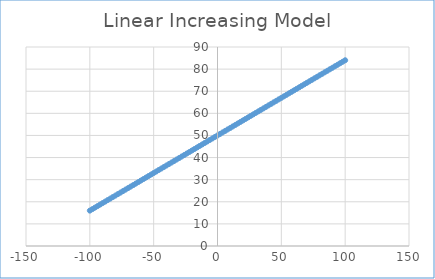
| Category | Y-Value |
|---|---|
| -100.0 | 16 |
| -98.0 | 16.68 |
| -96.0 | 17.36 |
| -94.0 | 18.04 |
| -92.0 | 18.72 |
| -90.0 | 19.4 |
| -88.0 | 20.08 |
| -86.0 | 20.76 |
| -84.0 | 21.44 |
| -82.0 | 22.12 |
| -80.0 | 22.8 |
| -78.0 | 23.48 |
| -76.0 | 24.16 |
| -74.0 | 24.84 |
| -72.0 | 25.52 |
| -70.0 | 26.2 |
| -68.0 | 26.88 |
| -66.0 | 27.56 |
| -64.0 | 28.24 |
| -62.0 | 28.92 |
| -60.0 | 29.6 |
| -58.0 | 30.28 |
| -56.0 | 30.96 |
| -54.0 | 31.64 |
| -52.0 | 32.32 |
| -50.0 | 33 |
| -48.0 | 33.68 |
| -46.0 | 34.36 |
| -44.0 | 35.04 |
| -42.0 | 35.72 |
| -40.0 | 36.4 |
| -38.0 | 37.08 |
| -36.0 | 37.76 |
| -34.0 | 38.44 |
| -32.0 | 39.12 |
| -30.0 | 39.8 |
| -28.0 | 40.48 |
| -26.0 | 41.16 |
| -24.0 | 41.84 |
| -22.0 | 42.52 |
| -20.0 | 43.2 |
| -18.0 | 43.88 |
| -16.0 | 44.56 |
| -14.0 | 45.24 |
| -12.0 | 45.92 |
| -10.0 | 46.6 |
| -8.0 | 47.28 |
| -6.0 | 47.96 |
| -4.0 | 48.64 |
| -2.0 | 49.32 |
| 0.0 | 50 |
| 2.0 | 50.68 |
| 4.0 | 51.36 |
| 6.0 | 52.04 |
| 8.0 | 52.72 |
| 10.0 | 53.4 |
| 12.0 | 54.08 |
| 14.0 | 54.76 |
| 16.0 | 55.44 |
| 18.0 | 56.12 |
| 20.0 | 56.8 |
| 22.0 | 57.48 |
| 24.0 | 58.16 |
| 26.0 | 58.84 |
| 28.0 | 59.52 |
| 30.0 | 60.2 |
| 32.0 | 60.88 |
| 34.0 | 61.56 |
| 36.0 | 62.24 |
| 38.0 | 62.92 |
| 40.0 | 63.6 |
| 42.0 | 64.28 |
| 44.0 | 64.96 |
| 46.0 | 65.64 |
| 48.0 | 66.32 |
| 50.0 | 67 |
| 52.0 | 67.68 |
| 54.0 | 68.36 |
| 56.0 | 69.04 |
| 58.0 | 69.72 |
| 60.0 | 70.4 |
| 62.0 | 71.08 |
| 64.0 | 71.76 |
| 66.0 | 72.44 |
| 68.0 | 73.12 |
| 70.0 | 73.8 |
| 72.0 | 74.48 |
| 74.0 | 75.16 |
| 76.0 | 75.84 |
| 78.0 | 76.52 |
| 80.0 | 77.2 |
| 82.0 | 77.88 |
| 84.0 | 78.56 |
| 86.0 | 79.24 |
| 88.0 | 79.92 |
| 90.0 | 80.6 |
| 92.0 | 81.28 |
| 94.0 | 81.96 |
| 96.0 | 82.64 |
| 98.0 | 83.32 |
| 100.0 | 84 |